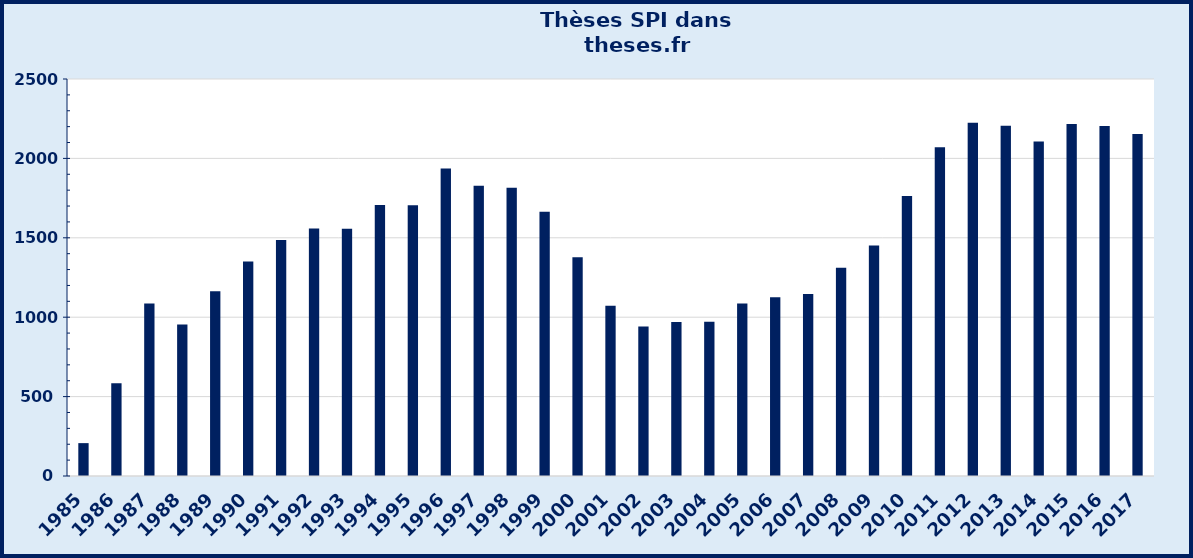
| Category | Series 0 |
|---|---|
| 1985.0 | 207 |
| 1986.0 | 584 |
| 1987.0 | 1086 |
| 1988.0 | 954 |
| 1989.0 | 1163 |
| 1990.0 | 1350 |
| 1991.0 | 1486 |
| 1992.0 | 1559 |
| 1993.0 | 1557 |
| 1994.0 | 1707 |
| 1995.0 | 1705 |
| 1996.0 | 1937 |
| 1997.0 | 1827 |
| 1998.0 | 1815 |
| 1999.0 | 1664 |
| 2000.0 | 1377 |
| 2001.0 | 1072 |
| 2002.0 | 941 |
| 2003.0 | 970 |
| 2004.0 | 972 |
| 2005.0 | 1086 |
| 2006.0 | 1126 |
| 2007.0 | 1146 |
| 2008.0 | 1311 |
| 2009.0 | 1452 |
| 2010.0 | 1764 |
| 2011.0 | 2070 |
| 2012.0 | 2224 |
| 2013.0 | 2206 |
| 2014.0 | 2107 |
| 2015.0 | 2216 |
| 2016.0 | 2204 |
| 2017.0 | 2154 |